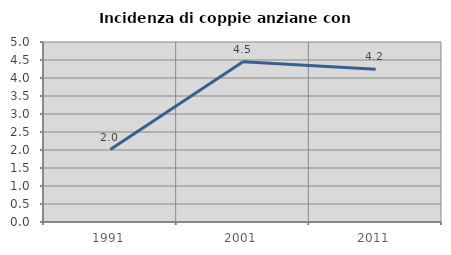
| Category | Incidenza di coppie anziane con figli |
|---|---|
| 1991.0 | 2.013 |
| 2001.0 | 4.452 |
| 2011.0 | 4.24 |